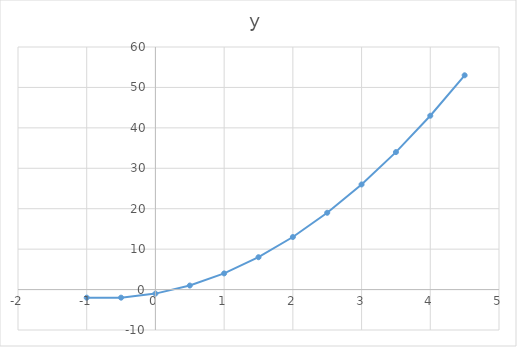
| Category | y |
|---|---|
| -1.0 | -2 |
| -0.5 | -2 |
| 0.0 | -1 |
| 0.5 | 1 |
| 1.0 | 4 |
| 1.5 | 8 |
| 2.0 | 13 |
| 2.5 | 19 |
| 3.0 | 26 |
| 3.5 | 34 |
| 4.0 | 43 |
| 4.5 | 53 |